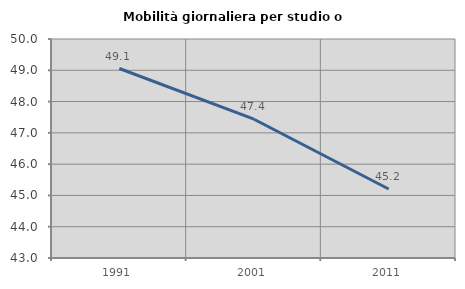
| Category | Mobilità giornaliera per studio o lavoro |
|---|---|
| 1991.0 | 49.057 |
| 2001.0 | 47.436 |
| 2011.0 | 45.205 |